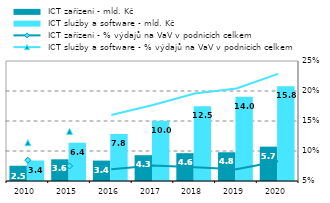
| Category |  ICT zařízení - mld. Kč |  ICT služby a software - mld. Kč |
|---|---|---|
| 2010.0 | 2.54 | 3.415 |
| 2015.0 | 3.612 | 6.388 |
| 2016.0 | 3.403 | 7.83 |
| 2017.0 | 4.301 | 10.029 |
| 2018.0 | 4.637 | 12.464 |
| 2019.0 | 4.789 | 14.041 |
| 2020.0 | 5.725 | 15.792 |